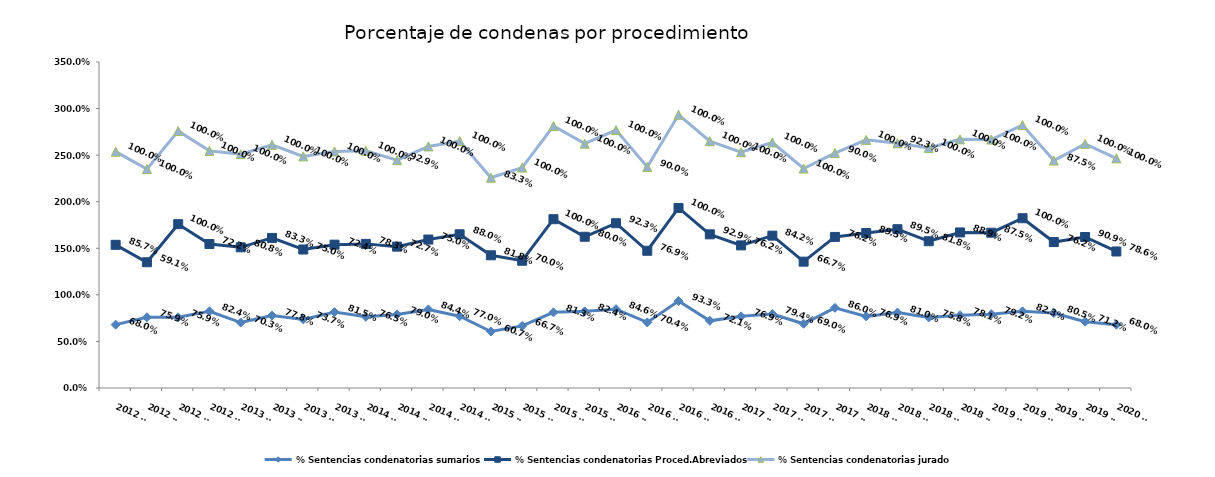
| Category | % Sentencias condenatorias sumarios | % Sentencias condenatorias Proced.Abreviados | % Sentencias condenatorias jurado |
|---|---|---|---|
| 2012 T1 | 0.68 | 0.857 | 1 |
| 2012 T2 | 0.759 | 0.591 | 1 |
| 2012 T3 | 0.759 | 1 | 1 |
| 2012 T4 | 0.824 | 0.722 | 1 |
| 2013 T1 | 0.703 | 0.808 | 1 |
| 2013 T2 | 0.778 | 0.833 | 1 |
| 2013 T3 | 0.737 | 0.75 | 1 |
| 2013 T4 | 0.815 | 0.724 | 1 |
| 2014 T1 | 0.765 | 0.783 | 1 |
| 2014 T2 | 0.79 | 0.727 | 0.929 |
| 2014 T3 | 0.844 | 0.75 | 1 |
| 2014 T4 | 0.77 | 0.88 | 1 |
| 2015 T1 | 0.607 | 0.818 | 0.833 |
| 2015 T2 | 0.667 | 0.7 | 1 |
| 2015 T3 | 0.812 | 1 | 1 |
| 2015 T4 | 0.824 | 0.8 | 1 |
| 2016 T1 | 0.846 | 0.923 | 1 |
| 2016 T2 | 0.704 | 0.769 | 0.9 |
| 2016 T3 | 0.933 | 1 | 1 |
| 2016 T4 | 0.721 | 0.929 | 1 |
| 2017 T1 | 0.769 | 0.762 | 1 |
| 2017 T2 | 0.794 | 0.842 | 1 |
| 2017 T3 | 0.69 | 0.667 | 1 |
| 2017 T4 | 0.86 | 0.762 | 0.9 |
| 2018 T1 | 0.769 | 0.895 | 1 |
| 2018 T2 | 0.81 | 0.895 | 0.923 |
| 2018 T3 | 0.758 | 0.818 | 1 |
| 2018 T4 | 0.781 | 0.889 | 1 |
| 2019 T1 | 0.792 | 0.875 | 1 |
| 2019 T2 | 0.823 | 1 | 1 |
| 2019 T3 | 0.805 | 0.762 | 0.875 |
| 2019 T4 | 0.712 | 0.909 | 1 |
| 2020 T1 | 0.68 | 0.786 | 1 |